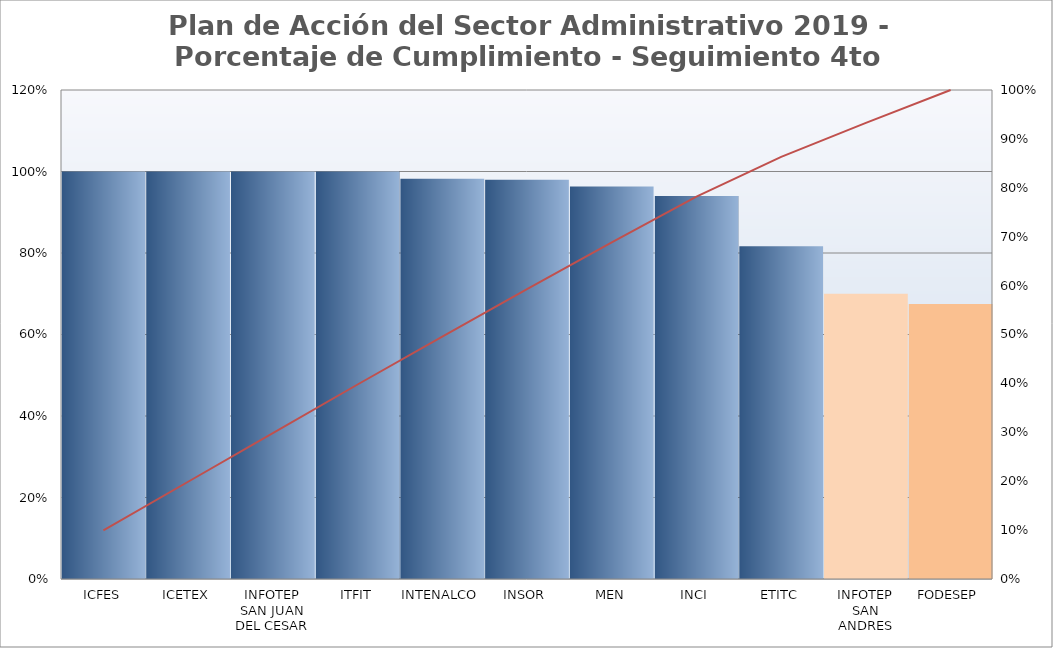
| Category | Promedio por Meta |
|---|---|
| Grupo 1 | 0.98 |
| Grupo 2 | 0.91 |
| Grupo 3 | 0.98 |